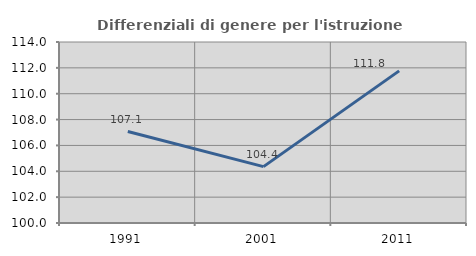
| Category | Differenziali di genere per l'istruzione superiore |
|---|---|
| 1991.0 | 107.077 |
| 2001.0 | 104.362 |
| 2011.0 | 111.768 |